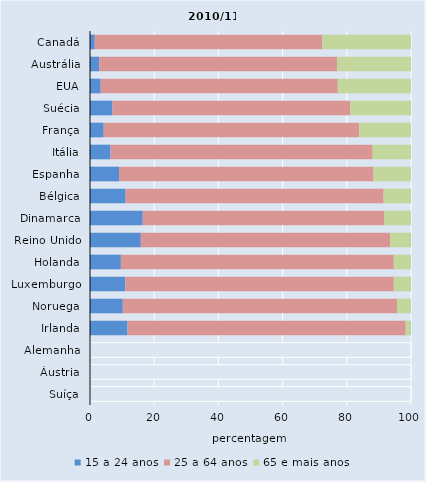
| Category | 15 a 24 anos | 25 a 64 anos | 65 e mais anos |
|---|---|---|---|
| Canadá | 1.486 | 70.924 | 27.589 |
| Austrália | 2.86 | 74.133 | 23.007 |
| EUA | 3.341 | 73.845 | 22.814 |
| Suécia | 7.018 | 74.035 | 18.947 |
| França | 4.274 | 79.603 | 16.123 |
| Itália | 6.412 | 81.634 | 11.954 |
| Espanha | 9.048 | 79.284 | 11.668 |
| Bélgica | 11.105 | 80.366 | 8.529 |
| Dinamarca | 16.432 | 75.308 | 8.26 |
| Reino Unido | 15.831 | 77.685 | 6.484 |
| Holanda | 9.619 | 85.018 | 5.363 |
| Luxemburgo | 11.038 | 83.603 | 5.359 |
| Noruega | 10.213 | 85.435 | 4.352 |
| Irlanda | 11.707 | 86.643 | 1.65 |
| Alemanha | 0 | 100 | 0 |
| Áustria | 0 | 100 | 0 |
| Suíça | 0 | 100 | 0 |